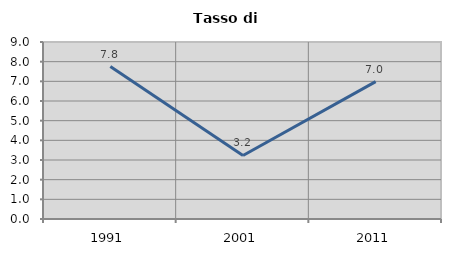
| Category | Tasso di disoccupazione   |
|---|---|
| 1991.0 | 7.753 |
| 2001.0 | 3.231 |
| 2011.0 | 6.984 |